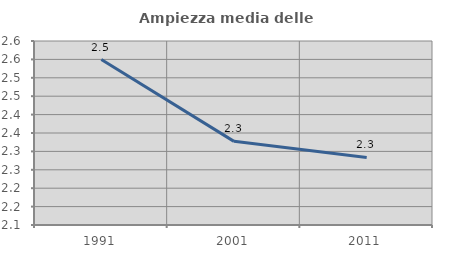
| Category | Ampiezza media delle famiglie |
|---|---|
| 1991.0 | 2.55 |
| 2001.0 | 2.327 |
| 2011.0 | 2.284 |